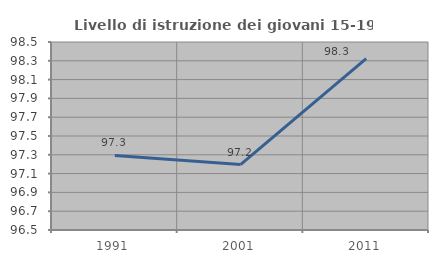
| Category | Livello di istruzione dei giovani 15-19 anni |
|---|---|
| 1991.0 | 97.293 |
| 2001.0 | 97.196 |
| 2011.0 | 98.322 |